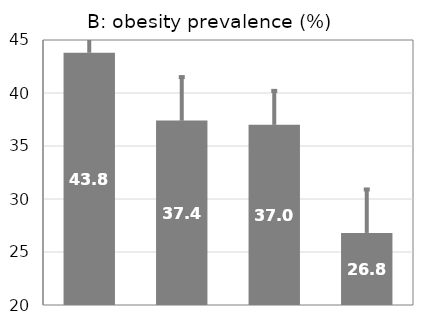
| Category | Series 0 |
|---|---|
| not bitter sensitive ate bitter vegs | 43.8 |
| bitter sensitive ate bitter vegs | 37.4 |
| not bitter sensitive not ate bitter vegs | 37 |
| bitter sensitive not ate bitter vegs | 26.8 |